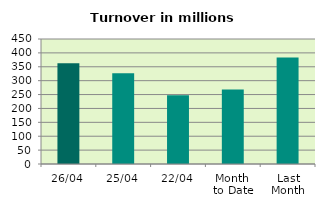
| Category | Series 0 |
|---|---|
| 26/04 | 362.649 |
| 25/04 | 327.045 |
| 22/04 | 247.497 |
| Month 
to Date | 268.31 |
| Last
Month | 383.695 |